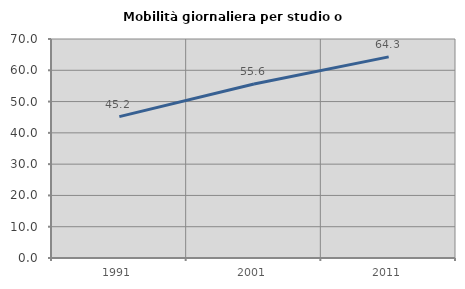
| Category | Mobilità giornaliera per studio o lavoro |
|---|---|
| 1991.0 | 45.202 |
| 2001.0 | 55.621 |
| 2011.0 | 64.286 |